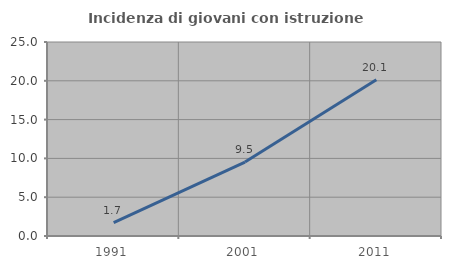
| Category | Incidenza di giovani con istruzione universitaria |
|---|---|
| 1991.0 | 1.712 |
| 2001.0 | 9.524 |
| 2011.0 | 20.139 |